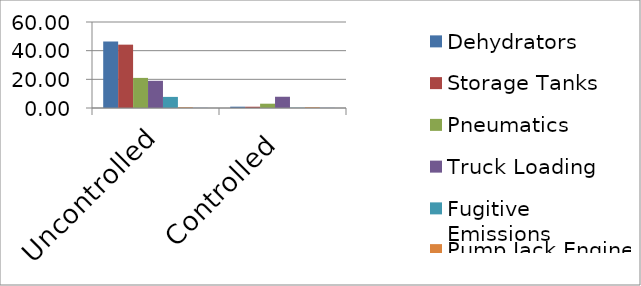
| Category | Dehydrators | Storage Tanks | Pneumatics | Truck Loading | Fugitive Emissions | Pump Jack Engine | Heaters/Boilers |
|---|---|---|---|---|---|---|---|
| Uncontrolled | 46.352 | 44.196 | 21 | 18.97 | 7.749 | 0.478 | 0.236 |
| Controlled | 0.927 | 0.894 | 3 | 7.85 | 0.162 | 0.478 | 0.236 |